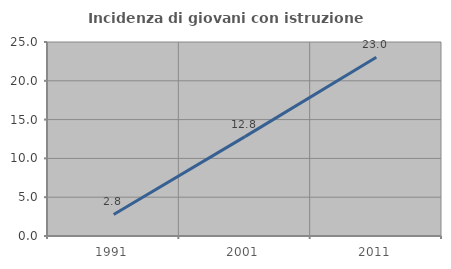
| Category | Incidenza di giovani con istruzione universitaria |
|---|---|
| 1991.0 | 2.778 |
| 2001.0 | 12.808 |
| 2011.0 | 23.026 |